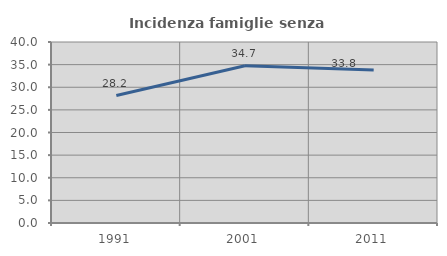
| Category | Incidenza famiglie senza nuclei |
|---|---|
| 1991.0 | 28.166 |
| 2001.0 | 34.739 |
| 2011.0 | 33.803 |